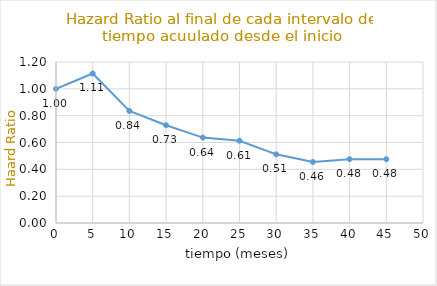
| Category | HRi |
|---|---|
| 0.0 | 1 |
| 5.0 | 1.114 |
| 10.0 | 0.835 |
| 15.0 | 0.729 |
| 20.0 | 0.637 |
| 25.0 | 0.613 |
| 30.0 | 0.512 |
| 35.0 | 0.455 |
| 40.0 | 0.476 |
| 45.0 | 0.476 |